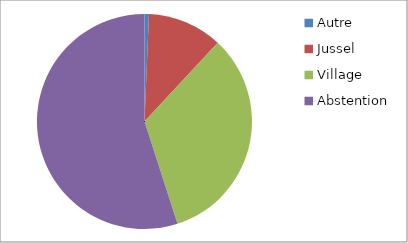
| Category | Series 0 |
|---|---|
| Autre | 1 |
| Jussel | 17 |
| Village | 50 |
| Abstention | 83 |